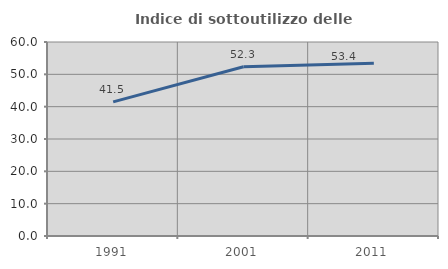
| Category | Indice di sottoutilizzo delle abitazioni  |
|---|---|
| 1991.0 | 41.494 |
| 2001.0 | 52.33 |
| 2011.0 | 53.448 |